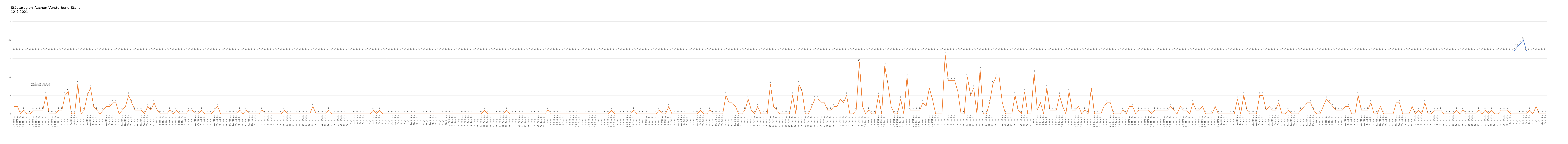
| Category | Verstorbene gesamt | Verstorbene Corona |
|---|---|---|
| 0 | 17 | 2 |
| 1 | 17 | 2 |
| 2 | 17 | 0 |
| 3 | 17 | 1 |
| 4 | 17 | 0 |
| 5 | 17 | 0 |
| 6 | 17 | 1 |
| 7 | 17 | 1 |
| 8 | 17 | 1 |
| 9 | 17 | 1 |
| 10 | 17 | 5 |
| 11 | 17 | 0 |
| 12 | 17 | 0 |
| 13 | 17 | 0 |
| 14 | 17 | 1 |
| 15 | 17 | 1 |
| 16 | 17 | 5 |
| 17 | 17 | 6 |
| 18 | 17 | 0 |
| 19 | 17 | 0 |
| 20 | 17 | 8 |
| 21 | 17 | 0 |
| 22 | 17 | 1 |
| 23 | 17 | 5 |
| 24 | 17 | 7 |
| 25 | 17 | 2 |
| 26 | 17 | 1 |
| 27 | 17 | 0 |
| 28 | 17 | 1 |
| 29 | 17 | 2 |
| 30 | 17 | 2 |
| 31 | 17 | 3 |
| 32 | 17 | 3 |
| 33 | 17 | 0 |
| 34 | 17 | 1 |
| 35 | 17 | 2 |
| 36 | 17 | 5 |
| 37 | 17 | 3 |
| 38 | 17 | 1 |
| 39 | 17 | 1 |
| 40 | 17 | 1 |
| 41 | 17 | 0 |
| 42 | 17 | 2 |
| 43 | 17 | 1 |
| 44 | 17 | 3 |
| 45 | 17 | 1 |
| 46 | 17 | 0 |
| 47 | 17 | 0 |
| 48 | 17 | 0 |
| 49 | 17 | 1 |
| 50 | 17 | 0 |
| 51 | 17 | 1 |
| 52 | 17 | 0 |
| 53 | 17 | 0 |
| 54 | 17 | 0 |
| 55 | 17 | 1 |
| 56 | 17 | 1 |
| 57 | 17 | 0 |
| 58 | 17 | 0 |
| 59 | 17 | 1 |
| 60 | 17 | 0 |
| 61 | 17 | 0 |
| 62 | 17 | 0 |
| 63 | 17 | 1 |
| 64 | 17 | 2 |
| 65 | 17 | 0 |
| 66 | 17 | 0 |
| 67 | 17 | 0 |
| 68 | 17 | 0 |
| 69 | 17 | 0 |
| 70 | 17 | 0 |
| 71 | 17 | 1 |
| 72 | 17 | 0 |
| 73 | 17 | 1 |
| 74 | 17 | 0 |
| 75 | 17 | 0 |
| 76 | 17 | 0 |
| 77 | 17 | 0 |
| 78 | 17 | 1 |
| 79 | 17 | 0 |
| 80 | 17 | 0 |
| 81 | 17 | 0 |
| 82 | 17 | 0 |
| 83 | 17 | 0 |
| 84 | 17 | 0 |
| 85 | 17 | 1 |
| 86 | 17 | 0 |
| 87 | 17 | 0 |
| 88 | 17 | 0 |
| 89 | 17 | 0 |
| 90 | 17 | 0 |
| 91 | 17 | 0 |
| 92 | 17 | 0 |
| 93 | 17 | 0 |
| 94 | 17 | 2 |
| 95 | 17 | 0 |
| 96 | 17 | 0 |
| 97 | 17 | 0 |
| 98 | 17 | 0 |
| 99 | 17 | 1 |
| 100 | 17 | 0 |
| 101 | 17 | 0 |
| 102 | 17 | 0 |
| 103 | 17 | 0 |
| 104 | 17 | 0 |
| 105 | 17 | 0 |
| 106 | 17 | 0 |
| 107 | 17 | 0 |
| 108 | 17 | 0 |
| 109 | 17 | 0 |
| 110 | 17 | 0 |
| 111 | 17 | 0 |
| 112 | 17 | 0 |
| 113 | 17 | 1 |
| 114 | 17 | 0 |
| 115 | 17 | 1 |
| 116 | 17 | 0 |
| 117 | 17 | 0 |
| 118 | 17 | 0 |
| 119 | 17 | 0 |
| 120 | 17 | 0 |
| 121 | 17 | 0 |
| 122 | 17 | 0 |
| 123 | 17 | 0 |
| 124 | 17 | 0 |
| 125 | 17 | 0 |
| 126 | 17 | 0 |
| 127 | 17 | 0 |
| 128 | 17 | 0 |
| 129 | 17 | 0 |
| 130 | 17 | 0 |
| 131 | 17 | 0 |
| 132 | 17 | 0 |
| 133 | 17 | 0 |
| 134 | 17 | 0 |
| 135 | 17 | 0 |
| 136 | 17 | 0 |
| 137 | 17 | 0 |
| 138 | 17 | 0 |
| 139 | 17 | 0 |
| 140 | 17 | 0 |
| 141 | 17 | 0 |
| 142 | 17 | 0 |
| 143 | 17 | 0 |
| 144 | 17 | 0 |
| 145 | 17 | 0 |
| 146 | 17 | 0 |
| 147 | 17 | 0 |
| 148 | 17 | 1 |
| 149 | 17 | 0 |
| 150 | 17 | 0 |
| 151 | 17 | 0 |
| 152 | 17 | 0 |
| 153 | 17 | 0 |
| 154 | 17 | 0 |
| 155 | 17 | 1 |
| 156 | 17 | 0 |
| 157 | 17 | 0 |
| 158 | 17 | 0 |
| 159 | 17 | 0 |
| 160 | 17 | 0 |
| 161 | 17 | 0 |
| 162 | 17 | 0 |
| 163 | 17 | 0 |
| 164 | 17 | 0 |
| 165 | 17 | 0 |
| 166 | 17 | 0 |
| 167 | 17 | 0 |
| 168 | 17 | 1 |
| 169 | 17 | 0 |
| 170 | 17 | 0 |
| 171 | 17 | 0 |
| 172 | 17 | 0 |
| 173 | 17 | 0 |
| 174 | 17 | 0 |
| 175 | 17 | 0 |
| 176 | 17 | 0 |
| 177 | 17 | 0 |
| 178 | 17 | 0 |
| 179 | 17 | 0 |
| 180 | 17 | 0 |
| 181 | 17 | 0 |
| 182 | 17 | 0 |
| 183 | 17 | 0 |
| 184 | 17 | 0 |
| 185 | 17 | 0 |
| 186 | 17 | 0 |
| 187 | 17 | 0 |
| 188 | 17 | 1 |
| 189 | 17 | 0 |
| 190 | 17 | 0 |
| 191 | 17 | 0 |
| 192 | 17 | 0 |
| 193 | 17 | 0 |
| 194 | 17 | 0 |
| 195 | 17 | 1 |
| 196 | 17 | 0 |
| 197 | 17 | 0 |
| 198 | 17 | 0 |
| 199 | 17 | 0 |
| 200 | 17 | 0 |
| 201 | 17 | 0 |
| 202 | 17 | 0 |
| 203 | 17 | 1 |
| 204 | 17 | 0 |
| 205 | 17 | 0 |
| 206 | 17 | 2 |
| 207 | 17 | 0 |
| 208 | 17 | 0 |
| 209 | 17 | 0 |
| 210 | 17 | 0 |
| 211 | 17 | 0 |
| 212 | 17 | 0 |
| 213 | 17 | 0 |
| 214 | 17 | 0 |
| 215 | 17 | 0 |
| 216 | 17 | 1 |
| 217 | 17 | 0 |
| 218 | 17 | 0 |
| 219 | 17 | 1 |
| 220 | 17 | 0 |
| 221 | 17 | 0 |
| 222 | 17 | 0 |
| 223 | 17 | 0 |
| 224 | 17 | 5 |
| 225 | 17 | 3 |
| 226 | 17 | 3 |
| 227 | 17 | 2 |
| 228 | 17 | 0 |
| 229 | 17 | 0 |
| 230 | 17 | 1 |
| 231 | 17 | 4 |
| 232 | 17 | 1 |
| 233 | 17 | 0 |
| 234 | 17 | 2 |
| 235 | 17 | 0 |
| 236 | 17 | 0 |
| 237 | 17 | 0 |
| 238 | 17 | 8 |
| 239 | 17 | 2 |
| 240 | 17 | 1 |
| 241 | 17 | 0 |
| 242 | 17 | 0 |
| 243 | 17 | 0 |
| 244 | 17 | 0 |
| 245 | 17 | 5 |
| 246 | 17 | 0 |
| 247 | 17 | 8 |
| 248 | 17 | 6 |
| 249 | 17 | 0 |
| 250 | 17 | 0 |
| 251 | 17 | 2 |
| 252 | 17 | 4 |
| 253 | 17 | 4 |
| 254 | 17 | 3 |
| 255 | 17 | 3 |
| 256 | 17 | 1 |
| 257 | 17 | 1 |
| 258 | 17 | 2 |
| 259 | 17 | 2 |
| 260 | 17 | 4 |
| 261 | 17 | 3 |
| 262 | 17 | 5 |
| 263 | 17 | 0 |
| 264 | 17 | 0 |
| 265 | 17 | 1 |
| 266 | 17 | 14 |
| 267 | 17 | 2 |
| 268 | 17 | 0 |
| 269 | 17 | 1 |
| 270 | 17 | 0 |
| 271 | 17 | 0 |
| 272 | 17 | 5 |
| 273 | 17 | 0 |
| 274 | 17 | 13 |
| 275 | 17 | 8 |
| 276 | 17 | 2 |
| 277 | 17 | 0 |
| 278 | 17 | 0 |
| 279 | 17 | 4 |
| 280 | 17 | 0 |
| 281 | 17 | 10 |
| 282 | 17 | 1 |
| 283 | 17 | 1 |
| 284 | 17 | 1 |
| 285 | 17 | 1 |
| 286 | 17 | 3 |
| 287 | 17 | 2 |
| 288 | 17 | 7 |
| 289 | 17 | 4 |
| 290 | 17 | 0 |
| 291 | 17 | 0 |
| 292 | 17 | 0 |
| 293 | 17 | 16 |
| 294 | 17 | 9 |
| 295 | 17 | 9 |
| 296 | 17 | 9 |
| 297 | 17 | 6 |
| 298 | 17 | 0 |
| 299 | 17 | 0 |
| 300 | 17 | 10 |
| 301 | 17 | 5 |
| 302 | 17 | 7 |
| 303 | 17 | 0 |
| 304 | 17 | 12 |
| 305 | 17 | 0 |
| 306 | 17 | 0 |
| 307 | 17 | 3 |
| 308 | 17 | 8 |
| 309 | 17 | 10 |
| 310 | 17 | 10 |
| 311 | 17 | 3 |
| 312 | 17 | 0 |
| 313 | 17 | 0 |
| 314 | 17 | 0 |
| 315 | 17 | 5 |
| 316 | 17 | 1 |
| 317 | 17 | 0 |
| 318 | 17 | 6 |
| 319 | 17 | 0 |
| 320 | 17 | 0 |
| 321 | 17 | 11 |
| 322 | 17 | 1 |
| 323 | 17 | 3 |
| 324 | 17 | 0 |
| 325 | 17 | 7 |
| 326 | 17 | 1 |
| 327 | 17 | 1 |
| 328 | 17 | 1 |
| 329 | 17 | 5 |
| 330 | 17 | 2 |
| 331 | 17 | 0 |
| 332 | 17 | 6 |
| 333 | 17 | 1 |
| 334 | 17 | 1 |
| 335 | 17 | 2 |
| 336 | 17 | 0 |
| 337 | 17 | 1 |
| 338 | 17 | 0 |
| 339 | 17 | 7 |
| 340 | 17 | 0 |
| 341 | 17 | 0 |
| 342 | 17 | 0 |
| 343 | 17 | 2 |
| 344 | 17 | 3 |
| 345 | 17 | 3 |
| 346 | 17 | 0 |
| 347 | 17 | 0 |
| 348 | 17 | 0 |
| 349 | 17 | 1 |
| 350 | 17 | 0 |
| 351 | 17 | 2 |
| 352 | 17 | 2 |
| 353 | 17 | 0 |
| 354 | 17 | 1 |
| 355 | 17 | 1 |
| 356 | 17 | 1 |
| 357 | 17 | 1 |
| 358 | 17 | 0 |
| 359 | 17 | 1 |
| 360 | 17 | 1 |
| 361 | 17 | 1 |
| 362 | 17 | 1 |
| 363 | 17 | 1 |
| 364 | 17 | 2 |
| 365 | 17 | 1 |
| 366 | 17 | 0 |
| 367 | 17 | 2 |
| 368 | 17 | 1 |
| 369 | 17 | 1 |
| 370 | 17 | 0 |
| 371 | 17 | 3 |
| 372 | 17 | 1 |
| 373 | 17 | 1 |
| 374 | 17 | 2 |
| 375 | 17 | 0 |
| 376 | 17 | 0 |
| 377 | 17 | 0 |
| 378 | 17 | 2 |
| 379 | 17 | 0 |
| 380 | 17 | 0 |
| 381 | 17 | 0 |
| 382 | 17 | 0 |
| 383 | 17 | 0 |
| 384 | 17 | 0 |
| 385 | 17 | 4 |
| 386 | 17 | 0 |
| 387 | 17 | 5 |
| 388 | 17 | 1 |
| 389 | 17 | 0 |
| 390 | 17 | 0 |
| 391 | 17 | 0 |
| 392 | 17 | 5 |
| 393 | 17 | 5 |
| 394 | 17 | 1 |
| 395 | 17 | 2 |
| 396 | 17 | 1 |
| 397 | 17 | 1 |
| 398 | 17 | 3 |
| 399 | 17 | 0 |
| 400 | 17 | 0 |
| 401 | 17 | 1 |
| 402 | 17 | 0 |
| 403 | 17 | 0 |
| 404 | 17 | 0 |
| 405 | 17 | 1 |
| 406 | 17 | 2 |
| 407 | 17 | 3 |
| 408 | 17 | 3 |
| 409 | 17 | 1 |
| 410 | 17 | 0 |
| 411 | 17 | 0 |
| 412 | 17 | 2 |
| 413 | 17 | 4 |
| 414 | 17 | 3 |
| 415 | 17 | 2 |
| 416 | 17 | 1 |
| 417 | 17 | 1 |
| 418 | 17 | 1 |
| 419 | 17 | 2 |
| 420 | 17 | 2 |
| 421 | 17 | 0 |
| 422 | 17 | 0 |
| 423 | 17 | 5 |
| 424 | 17 | 1 |
| 425 | 17 | 1 |
| 426 | 17 | 1 |
| 427 | 17 | 3 |
| 428 | 17 | 0 |
| 429 | 17 | 0 |
| 430 | 17 | 2 |
| 431 | 17 | 0 |
| 432 | 17 | 0 |
| 433 | 17 | 0 |
| 434 | 17 | 0 |
| 435 | 17 | 3 |
| 436 | 17 | 3 |
| 437 | 17 | 0 |
| 438 | 17 | 0 |
| 439 | 17 | 0 |
| 440 | 17 | 2 |
| 441 | 17 | 0 |
| 442 | 17 | 1 |
| 443 | 17 | 0 |
| 444 | 17 | 3 |
| 445 | 17 | 0 |
| 446 | 17 | 0 |
| 447 | 17 | 1 |
| 448 | 17 | 1 |
| 449 | 17 | 1 |
| 450 | 17 | 0 |
| 451 | 17 | 0 |
| 452 | 17 | 0 |
| 453 | 17 | 0 |
| 454 | 17 | 1 |
| 455 | 17 | 0 |
| 456 | 17 | 1 |
| 457 | 17 | 0 |
| 458 | 17 | 0 |
| 459 | 17 | 0 |
| 460 | 17 | 0 |
| 461 | 17 | 1 |
| 462 | 17 | 0 |
| 463 | 17 | 1 |
| 464 | 17 | 0 |
| 465 | 17 | 1 |
| 466 | 17 | 0 |
| 467 | 17 | 0 |
| 468 | 17 | 1 |
| 469 | 17 | 1 |
| 470 | 17 | 1 |
| 471 | 17 | 0 |
| 472 | 17 | 0 |
| 473 | 18 | 0 |
| 474 | 19 | 0 |
| 475 | 20 | 0 |
| 476 | 17 | 0 |
| 477 | 17 | 1 |
| 478 | 17 | 0 |
| 479 | 17 | 2 |
| 480 | 17 | 0 |
| 481 | 17 | 0 |
| 482 | 17 | 0 |